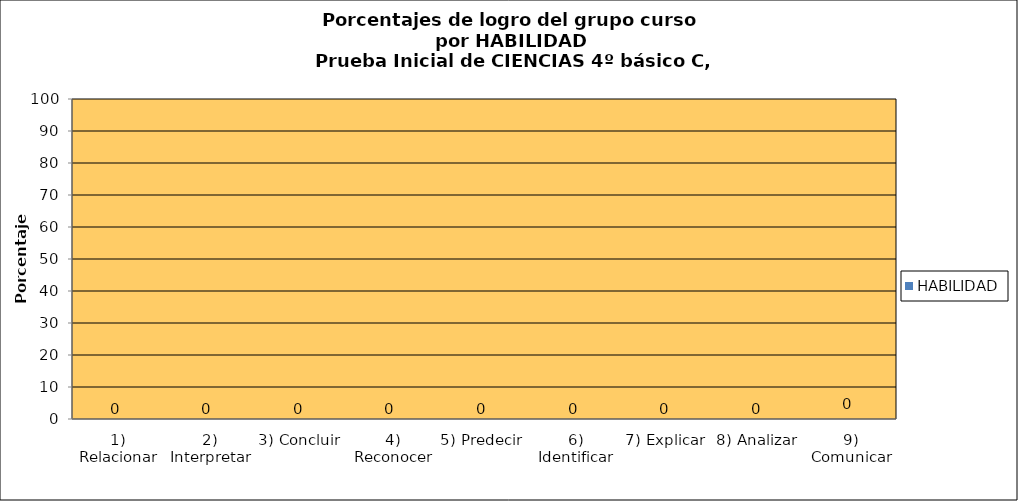
| Category | HABILIDAD |
|---|---|
| 1) Relacionar | 0 |
| 2) Interpretar | 0 |
| 3) Concluir | 0 |
| 4) Reconocer | 0 |
| 5) Predecir | 0 |
| 6) Identificar | 0 |
| 7) Explicar | 0 |
| 8) Analizar | 0 |
| 9) Comunicar | 0 |